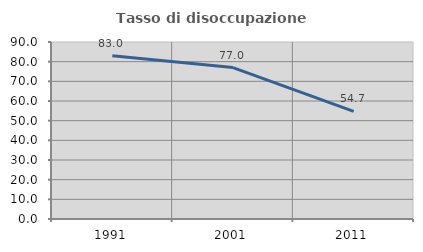
| Category | Tasso di disoccupazione giovanile  |
|---|---|
| 1991.0 | 83.019 |
| 2001.0 | 77.011 |
| 2011.0 | 54.717 |